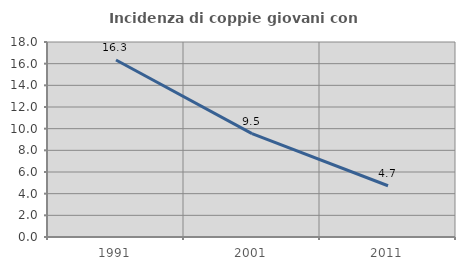
| Category | Incidenza di coppie giovani con figli |
|---|---|
| 1991.0 | 16.342 |
| 2001.0 | 9.541 |
| 2011.0 | 4.73 |